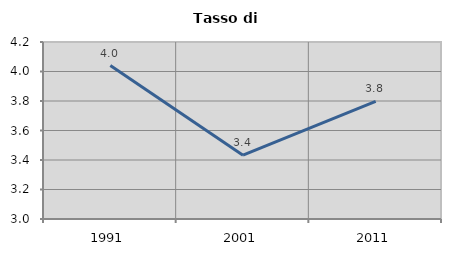
| Category | Tasso di disoccupazione   |
|---|---|
| 1991.0 | 4.04 |
| 2001.0 | 3.432 |
| 2011.0 | 3.797 |